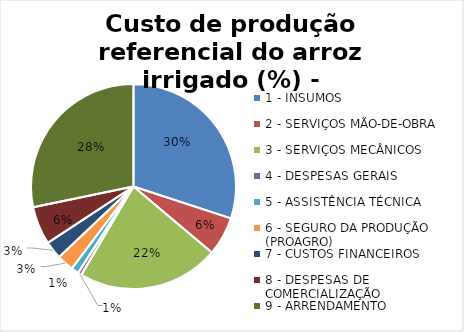
| Category | Series 0 |
|---|---|
| 1 - INSUMOS | 30.03 |
| 2 - SERVIÇOS MÃO-DE-OBRA | 6.106 |
| 3 - SERVIÇOS MECÂNICOS | 22.352 |
| 4 - DESPESAS GERAIS  | 0.585 |
| 5 - ASSISTÊNCIA TÉCNICA | 1.181 |
| 6 - SEGURO DA PRODUÇÃO (PROAGRO) | 2.658 |
| 7 - CUSTOS FINANCEIROS | 2.831 |
| 8 - DESPESAS DE COMERCIALIZAÇÃO | 6.009 |
| 9 - ARRENDAMENTO | 28.248 |